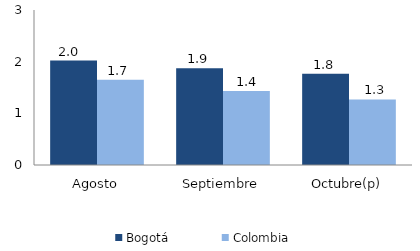
| Category | Bogotá | Colombia |
|---|---|---|
| Agosto | 2.021 | 1.652 |
| Septiembre | 1.87 | 1.43 |
| Octubre(p) | 1.768 | 1.27 |